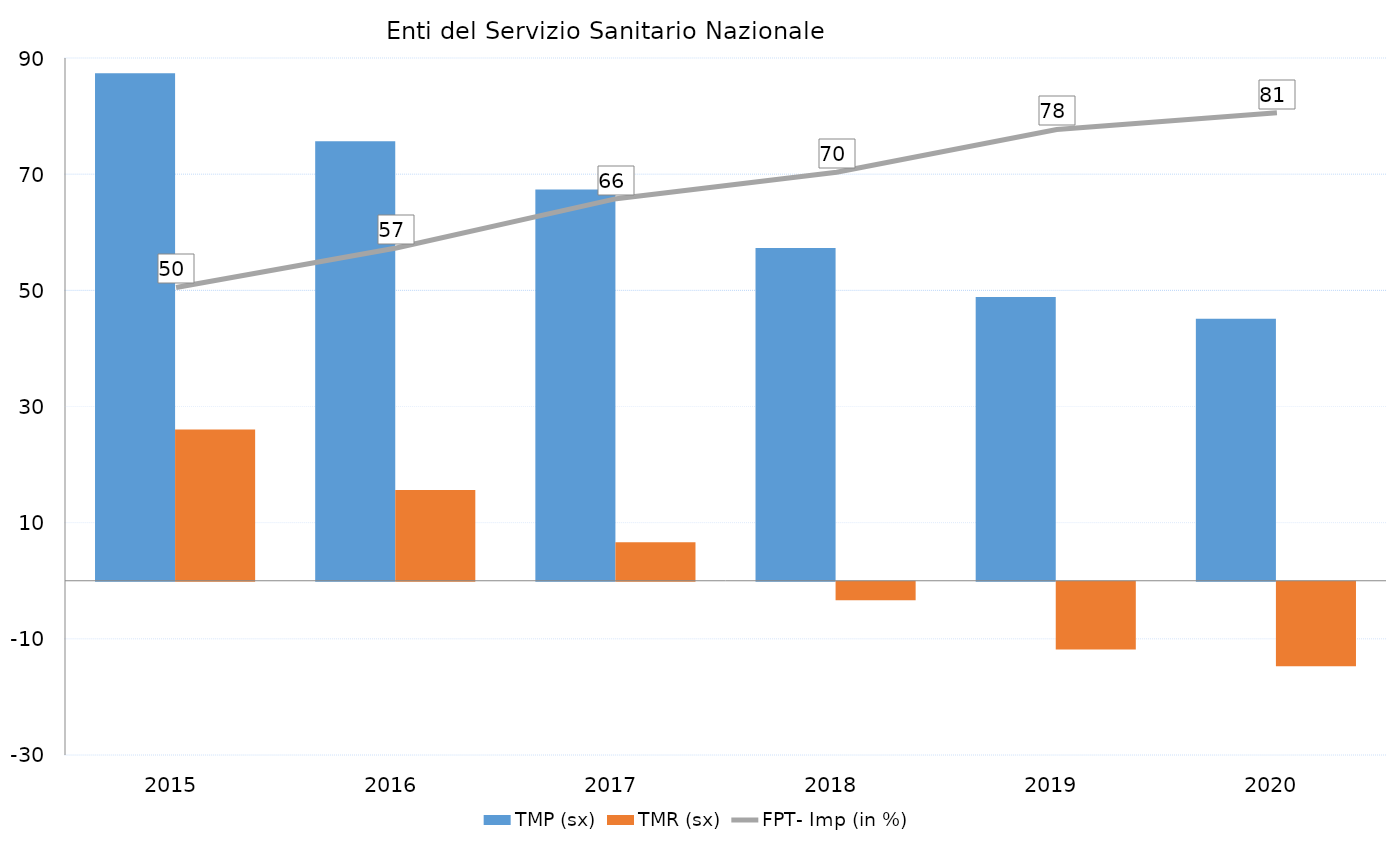
| Category | TMP (sx) | TMR (sx) |
|---|---|---|
| 2015.0 | 87.394 | 26.06 |
| 2016.0 | 75.684 | 15.622 |
| 2017.0 | 67.342 | 6.635 |
| 2018.0 | 57.294 | -3.205 |
| 2019.0 | 48.85 | -11.666 |
| 2020.0 | 45.111 | -14.534 |